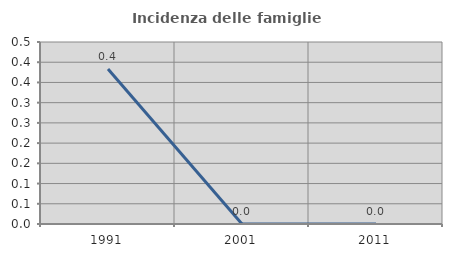
| Category | Incidenza delle famiglie numerose |
|---|---|
| 1991.0 | 0.383 |
| 2001.0 | 0 |
| 2011.0 | 0 |